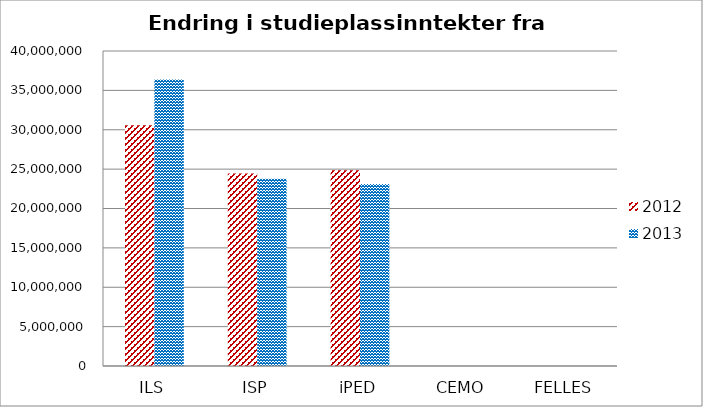
| Category | 2012 | 2013 |
|---|---|---|
| ILS | 30583000 | 36373000 |
| ISP | 24452000 | 23782000 |
| iPED | 24856000 | 23102000 |
| CEMO | 0 | 0 |
| FELLES | 0 | 0 |